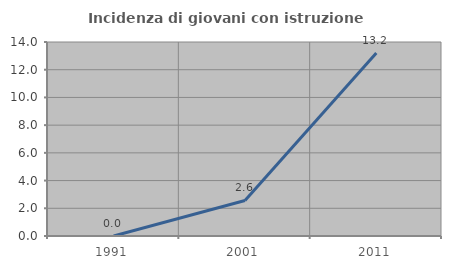
| Category | Incidenza di giovani con istruzione universitaria |
|---|---|
| 1991.0 | 0 |
| 2001.0 | 2.564 |
| 2011.0 | 13.208 |